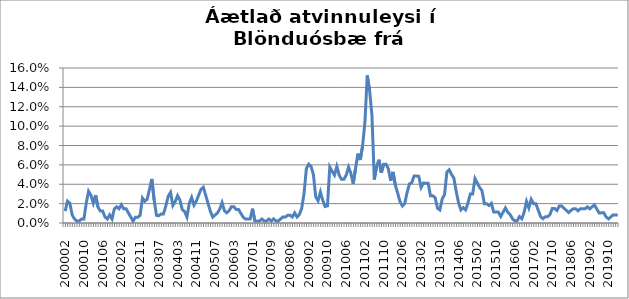
| Category | Series 0 |
|---|---|
| 200002 | 0.012 |
| 200003 | 0.023 |
| 200004 | 0.02 |
| 200005 | 0.008 |
| 200006 | 0.004 |
| 200007 | 0.002 |
| 200008 | 0.002 |
| 200009 | 0.004 |
| 200010 | 0.004 |
| 200011 | 0.02 |
| 200012 | 0.033 |
| 200101 | 0.029 |
| 200102 | 0.021 |
| 200103 | 0.029 |
| 200104 | 0.016 |
| 200105 | 0.012 |
| 200106 | 0.012 |
| 200107 | 0.006 |
| 200108 | 0.004 |
| 200109 | 0.008 |
| 200110 | 0.004 |
| 200111 | 0.015 |
| 200112 | 0.017 |
| 200201 | 0.015 |
| 200202 | 0.019 |
| 200203 | 0.015 |
| 200204 | 0.015 |
| 200205 | 0.01 |
| 200206 | 0.006 |
| 200208 | 0.002 |
| 200209 | 0.006 |
| 200210 | 0.006 |
| 200211 | 0.008 |
| 200212 | 0.026 |
| 200301 | 0.022 |
| 200302 | 0.024 |
| 200303 | 0.035 |
| 200304 | 0.045 |
| 200305 | 0.024 |
| 200306 | 0.008 |
| 200307 | 0.008 |
| 200308 | 0.009 |
| 200309 | 0.009 |
| 200310 | 0.018 |
| 200311 | 0.028 |
| 200312 | 0.032 |
| 200401 | 0.018 |
| 200402 | 0.022 |
| 200403 | 0.028 |
| 200404 | 0.024 |
| 200405 | 0.014 |
| 200406 | 0.012 |
| 200407 | 0.006 |
| 200408 | 0.02 |
| 200409 | 0.026 |
| 200410 | 0.018 |
| 200411 | 0.023 |
| 200412 | 0.029 |
| 200501 | 0.035 |
| 200502 | 0.037 |
| 200503 | 0.029 |
| 200504 | 0.02 |
| 200505 | 0.012 |
| 200506 | 0.006 |
| 200507 | 0.008 |
| 200508 | 0.01 |
| 200509 | 0.014 |
| 200510 | 0.021 |
| 200511 | 0.013 |
| 200512 | 0.011 |
| 200601 | 0.013 |
| 200602 | 0.017 |
| 200603 | 0.017 |
| 200604 | 0.014 |
| 200605 | 0.014 |
| 200606 | 0.01 |
| 200607 | 0.006 |
| 200608 | 0.004 |
| 200609 | 0.004 |
| 200612 | 0.004 |
| 200701 | 0.015 |
| 200702 | 0.002 |
| 200703 | 0.002 |
| 200704 | 0.002 |
| 200705 | 0.004 |
| 200706 | 0.002 |
| 200707 | 0.002 |
| 200708 | 0.004 |
| 200709 | 0.002 |
| 200711 | 0.004 |
| 200712 | 0.002 |
| 200801 | 0.002 |
| 200802 | 0.004 |
| 200803 | 0.006 |
| 200804 | 0.006 |
| 200805 | 0.008 |
| 200806 | 0.008 |
| 200807 | 0.006 |
| 200808 | 0.01 |
| 200809 | 0.006 |
| 200810 | 0.009 |
| 200811 | 0.015 |
| 200812 | 0.03 |
| 200901 | 0.056 |
| 200902 | 0.061 |
| 200903 | 0.058 |
| 200904 | 0.05 |
| 200905 | 0.027 |
| 200906 | 0.023 |
| 200907 | 0.032 |
| 200908 | 0.023 |
| 200909 | 0.017 |
| 200910 | 0.018 |
| 200911 | 0.058 |
| 200912 | 0.053 |
| 201001 | 0.049 |
| 201002 | 0.058 |
| 201003 | 0.049 |
| 201004 | 0.045 |
| 201005 | 0.045 |
| 201006 | 0.049 |
| 201007 | 0.058 |
| 201008 | 0.051 |
| 201009 | 0.041 |
| 201010 | 0.056 |
| 201011 | 0.072 |
| 201012 | 0.065 |
| 201101 | 0.079 |
| 201102 | 0.104 |
| 201103 | 0.152 |
| 201104 | 0.137 |
| 201105 | 0.111 |
| 201106 | 0.045 |
| 201107 | 0.059 |
| 201108 | 0.065 |
| 201109 | 0.052 |
| 201110 | 0.061 |
| 201111 | 0.061 |
| 201112 | 0.056 |
| 201201 | 0.044 |
| 201202 | 0.053 |
| 201203 | 0.039 |
| 201204 | 0.031 |
| 201205 | 0.022 |
| 201206 | 0.018 |
| 201207 | 0.02 |
| 201208 | 0.031 |
| 201209 | 0.04 |
| 201210 | 0.042 |
| 201211 | 0.048 |
| 201212 | 0.048 |
| 201301 | 0.048 |
| 201302 | 0.037 |
| 201303 | 0.041 |
| 201304 | 0.041 |
| 201305 | 0.041 |
| 201306 | 0.028 |
| 201307 | 0.028 |
| 201308 | 0.026 |
| 201309 | 0.015 |
| 201310 | 0.014 |
| 201311 | 0.025 |
| 201312 | 0.029 |
| 201401 | 0.053 |
| 201402 | 0.055 |
| 201403 | 0.05 |
| 201404 | 0.046 |
| 201405 | 0.032 |
| 201406 | 0.021 |
| 201407 | 0.014 |
| 201408 | 0.016 |
| 201409 | 0.014 |
| 201410 | 0.021 |
| 201411 | 0.03 |
| 201412 | 0.03 |
| 201501 | 0.046 |
| 201502 | 0.041 |
| 201503 | 0.037 |
| 201504 | 0.033 |
| 201505 | 0.02 |
| 201506 | 0.02 |
| 201507 | 0.018 |
| 201508 | 0.02 |
| 201509 | 0.011 |
| 201510 | 0.011 |
| 201511 | 0.011 |
| 201512 | 0.007 |
| 201601 | 0.011 |
| 201602 | 0.016 |
| 201603 | 0.011 |
| 201604 | 0.009 |
| 201605 | 0.004 |
| 201606 | 0.002 |
| 201607 | 0.002 |
| 201608 | 0.007 |
| 201609 | 0.004 |
| 201610 | 0.011 |
| 201611 | 0.022 |
| 201612 | 0.016 |
| 201701 | 0.024 |
| 201702 | 0.02 |
| 201703 | 0.02 |
| 201704 | 0.013 |
| 201705 | 0.007 |
| 201706 | 0.004 |
| 201707 | 0.006 |
| 201708 | 0.006 |
| 201709 | 0.009 |
| 201710 | 0.015 |
| 201711 | 0.015 |
| 201712 | 0.013 |
| 201801 | 0.018 |
| 201802 | 0.018 |
| 201803 | 0.015 |
| 201804 | 0.013 |
| 201805 | 0.011 |
| 201806 | 0.013 |
| 201807 | 0.015 |
| 201808 | 0.015 |
| 201809 | 0.013 |
| 201810 | 0.015 |
| 201811 | 0.015 |
| 201812 | 0.015 |
| 201901 | 0.017 |
| 201902 | 0.015 |
| 201903 | 0.017 |
| 201904 | 0.019 |
| 201905 | 0.015 |
| 201906 | 0.01 |
| 201907 | 0.01 |
| 201908 | 0.01 |
| 201909 | 0.006 |
| 201910 | 0.004 |
| 201911 | 0.006 |
| 201912 | 0.008 |
| 202001 | 0.008 |
| 202002 | 0.008 |